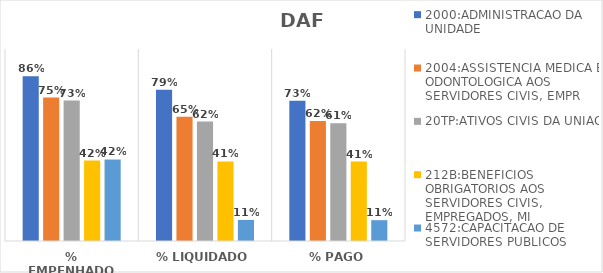
| Category | 2000:ADMINISTRACAO DA UNIDADE | 2004:ASSISTENCIA MEDICA E ODONTOLOGICA AOS SERVIDORES CIVIS, EMPR | 20TP:ATIVOS CIVIS DA UNIAO | 212B:BENEFICIOS OBRIGATORIOS AOS SERVIDORES CIVIS, EMPREGADOS, MI | 4572:CAPACITACAO DE SERVIDORES PUBLICOS FEDERAIS EM PROCESSO DE Q |
|---|---|---|---|---|---|
| % EMPENHADO | 0.859 | 0.747 | 0.731 | 0.419 | 0.425 |
| % LIQUIDADO | 0.788 | 0.647 | 0.622 | 0.414 | 0.11 |
| % PAGO | 0.73 | 0.625 | 0.613 | 0.414 | 0.109 |